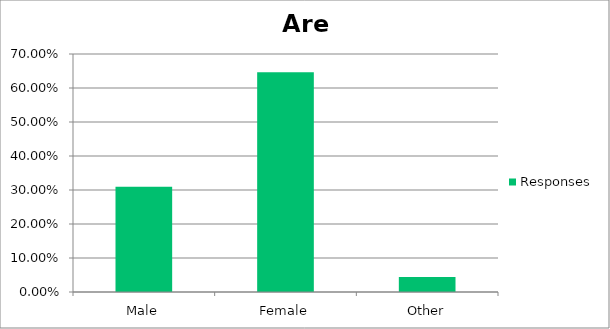
| Category | Responses |
|---|---|
| Male | 0.31 |
| Female | 0.646 |
| Other | 0.044 |